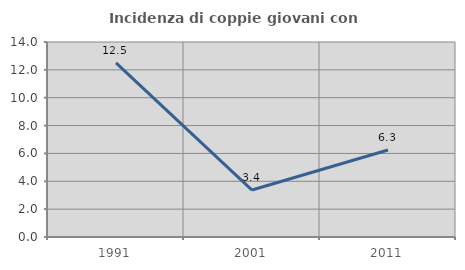
| Category | Incidenza di coppie giovani con figli |
|---|---|
| 1991.0 | 12.5 |
| 2001.0 | 3.371 |
| 2011.0 | 6.25 |